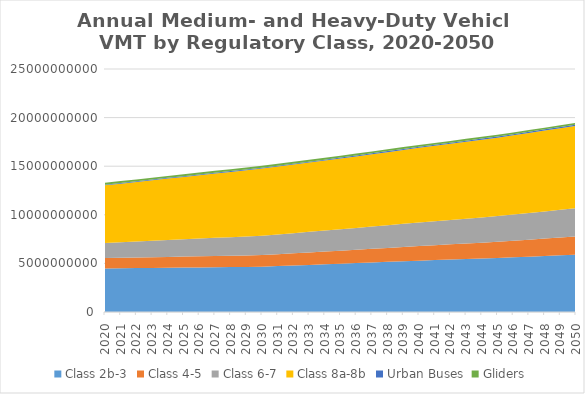
| Category | Class 2b-3 | Class 4-5 | Class 6-7 | Class 8a-8b | Urban Buses | Gliders |
|---|---|---|---|---|---|---|
| 2020.0 | 4484283495.538 | 1060667452 | 1566301360.769 | 5923979827.846 | 67220621.02 | 190233532.964 |
| 2021.0 | 4501739693.385 | 1074101049 | 1609272738.692 | 6022172932.462 | 69647266.532 | 191189360.077 |
| 2022.0 | 4519195891.231 | 1087534646 | 1652244116.615 | 6120366037.077 | 72073912.044 | 192145187.19 |
| 2023.0 | 4536652089.077 | 1100968243 | 1695215494.538 | 6218559141.692 | 74500557.556 | 193101014.303 |
| 2024.0 | 4554108286.923 | 1114401840 | 1738186872.462 | 6316752246.308 | 76927203.069 | 194056841.416 |
| 2025.0 | 4571564484.769 | 1127835437 | 1781158250.385 | 6414945350.923 | 79353848.581 | 195012668.529 |
| 2026.0 | 4589020682.615 | 1141269034 | 1824129628.308 | 6513138455.538 | 81780494.093 | 195968495.642 |
| 2027.0 | 4606476880.462 | 1154702631 | 1867101006.231 | 6611331560.154 | 84207139.605 | 196924322.755 |
| 2028.0 | 4623933078.308 | 1168136228 | 1910072384.154 | 6709524664.769 | 86633785.117 | 197880149.868 |
| 2029.0 | 4641389276.154 | 1181569825 | 1953043762.077 | 6807717769.385 | 89060430.629 | 198835976.981 |
| 2030.0 | 4658845474 | 1195003422 | 1996015140 | 6905910874 | 91487076.141 | 199791804.094 |
| 2031.0 | 4721086451.536 | 1223511540.223 | 2037166844.803 | 6979212486.495 | 93504956.817 | 198788462.832 |
| 2032.0 | 4783327429.072 | 1252019658.446 | 2078318549.606 | 7052514098.991 | 95522837.493 | 197785121.57 |
| 2033.0 | 4845568406.608 | 1280527776.669 | 2119470254.408 | 7125815711.486 | 97540718.169 | 196781780.307 |
| 2034.0 | 4907809384.144 | 1309035894.892 | 2160621959.211 | 7199117323.981 | 99558598.845 | 195778439.045 |
| 2035.0 | 4970050361.68 | 1337544013.115 | 2201773664.014 | 7272418936.477 | 101576479.522 | 194775097.783 |
| 2036.0 | 5032775714.544 | 1369437174.092 | 2246980270.811 | 7353359625.181 | 103845348.317 | 193619799.327 |
| 2037.0 | 5095501067.408 | 1401330335.069 | 2292186877.608 | 7434300313.886 | 106114217.113 | 192464500.87 |
| 2038.0 | 5158226420.272 | 1433223496.046 | 2337393484.406 | 7515241002.591 | 108383085.909 | 191309202.413 |
| 2039.0 | 5220951773.136 | 1465116657.023 | 2382600091.203 | 7596181691.295 | 110651954.704 | 190153903.957 |
| 2040.0 | 5283677126 | 1497009818 | 2427806698 | 7677122380 | 112920823.5 | 188998605.5 |
| 2041.0 | 5337465889.906 | 1531644343.431 | 2470900238.121 | 7753797861.336 | 114630319.476 | 187535272.723 |
| 2042.0 | 5391254653.813 | 1566278868.861 | 2513993778.242 | 7830473342.672 | 116339815.452 | 186071939.945 |
| 2043.0 | 5445043417.719 | 1600913394.292 | 2557087318.362 | 7907148824.007 | 118049311.428 | 184608607.168 |
| 2044.0 | 5498832181.625 | 1635547919.723 | 2600180858.483 | 7983824305.343 | 119758807.404 | 183145274.39 |
| 2045.0 | 5552620945.531 | 1670182445.153 | 2643274398.604 | 8060499786.679 | 121468303.38 | 181681941.613 |
| 2046.0 | 5621127059.225 | 1711264904.323 | 2695090255.083 | 8144145326.143 | 123301671.723 | 180631085.653 |
| 2047.0 | 5689633172.919 | 1752347363.492 | 2746906111.562 | 8227790865.607 | 125135040.066 | 179580229.693 |
| 2048.0 | 5758139286.613 | 1793429822.661 | 2798721968.042 | 8311436405.072 | 126968408.408 | 178529373.733 |
| 2049.0 | 5826645400.306 | 1834512281.831 | 2850537824.521 | 8395081944.536 | 128801776.751 | 177478517.773 |
| 2050.0 | 5895151514 | 1875594741 | 2902353681 | 8478727484 | 130635145.094 | 176427661.812 |